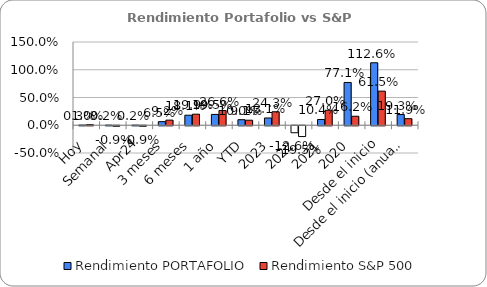
| Category | Rendimiento PORTAFOLIO | Rendimiento S&P 500 |
|---|---|---|
| Hoy | 0.003 | 0.01 |
| Semanal | 0.002 | -0.009 |
| Abr24 | 0.002 | -0.009 |
| 3 meses | 0.065 | 0.092 |
| 6 meses | 0.181 | 0.199 |
| 1 año | 0.195 | 0.266 |
| YTD | 0.1 | 0.091 |
| 2023 | 0.131 | 0.243 |
| 2022 | -0.126 | -0.195 |
| 2021 | 0.104 | 0.27 |
| 2020 | 0.771 | 0.162 |
| Desde el inicio | 1.126 | 0.615 |
| Desde el inicio (anual) | 0.193 | 0.119 |